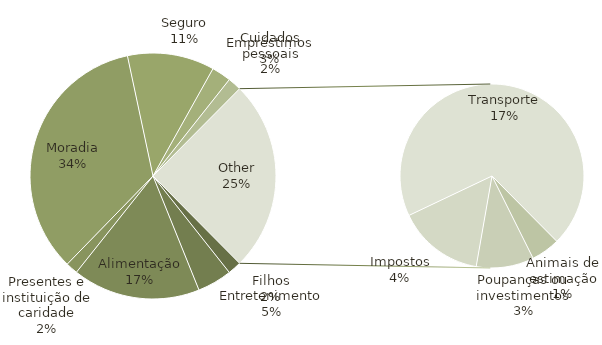
| Category | Total |
|---|---|
| Filhos | 140 |
| Entretenimento | 358 |
| Alimentação | 1320 |
| Presentes e instituição de caridade | 125 |
| Moradia | 2702 |
| Seguro | 900 |
| Empréstimos | 200 |
| Cuidados pessoais | 140 |
| Animais de estimação | 100 |
| Poupanças ou investimentos | 200 |
| Impostos | 300 |
| Transporte | 1375 |